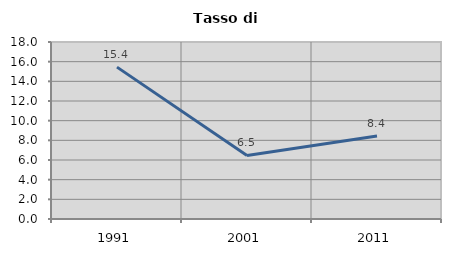
| Category | Tasso di disoccupazione   |
|---|---|
| 1991.0 | 15.444 |
| 2001.0 | 6.464 |
| 2011.0 | 8.446 |